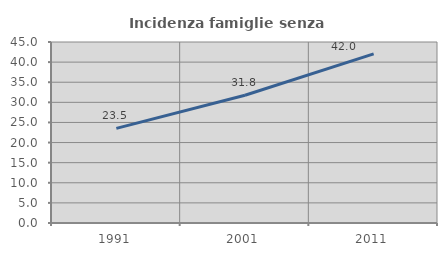
| Category | Incidenza famiglie senza nuclei |
|---|---|
| 1991.0 | 23.515 |
| 2001.0 | 31.769 |
| 2011.0 | 42.034 |